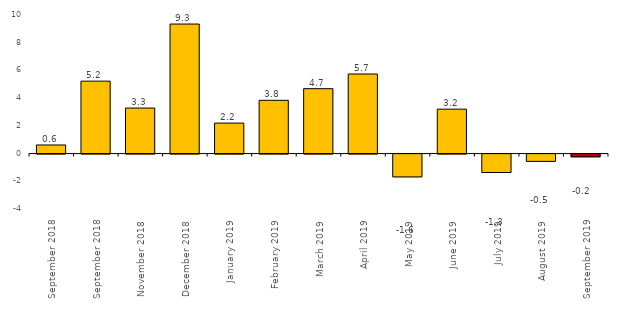
| Category | Series 0 |
|---|---|
| September 2018 | 0.62 |
| September 2018 | 5.226 |
| November 2018 | 3.285 |
| December 2018 | 9.348 |
| January 2019 | 2.2 |
| February 2019 | 3.843 |
| March 2019 | 4.683 |
| April 2019 | 5.742 |
| May 2019 | -1.648 |
| June 2019 | 3.205 |
| July 2019 | -1.329 |
| August 2019 | -0.528 |
| September 2019 | -0.196 |